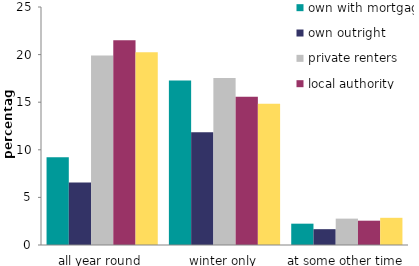
| Category | own with mortgage | own outright | private renters | local authority | housing association |
|---|---|---|---|---|---|
| all year round | 9.218 | 6.56 | 19.906 | 21.52 | 20.244 |
| winter only | 17.279 | 11.851 | 17.54 | 15.581 | 14.826 |
| at some other time | 2.24 | 1.662 | 2.771 | 2.554 | 2.856 |